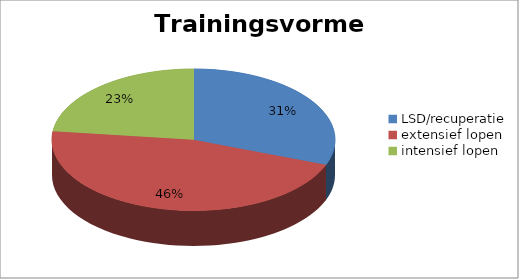
| Category | Series 0 |
|---|---|
| LSD/recuperatie | 60 |
| extensief lopen | 90 |
| intensief lopen | 45 |